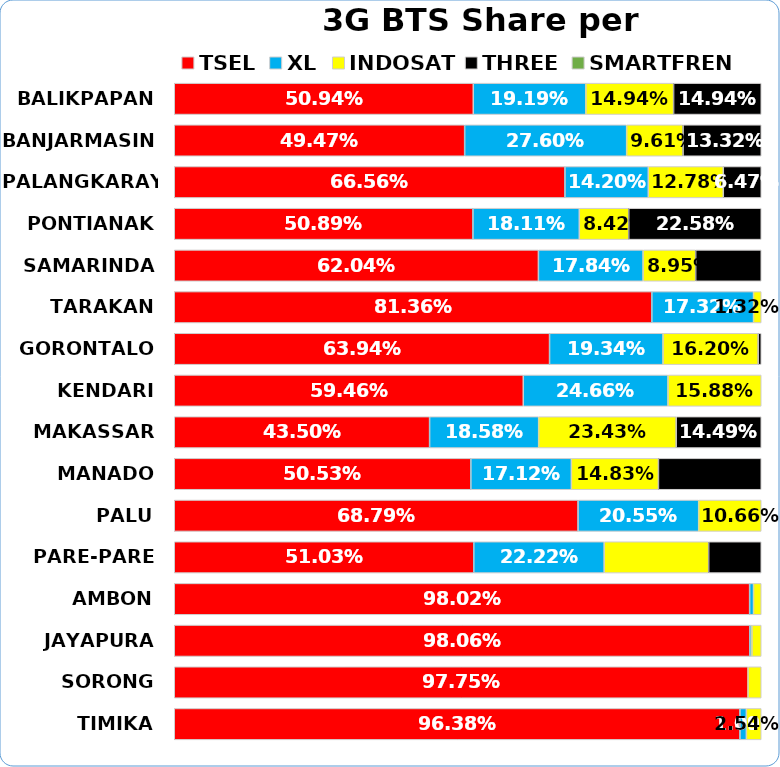
| Category | TSEL | XL | INDOSAT | THREE | SMARTFREN |
|---|---|---|---|---|---|
| BALIKPAPAN | 0.509 | 0.192 | 0.149 | 0.149 | 0 |
| BANJARMASIN | 0.495 | 0.276 | 0.096 | 0.133 | 0 |
| PALANGKARAYA | 0.666 | 0.142 | 0.128 | 0.065 | 0 |
| PONTIANAK | 0.509 | 0.181 | 0.084 | 0.226 | 0 |
| SAMARINDA | 0.62 | 0.178 | 0.09 | 0.112 | 0 |
| TARAKAN | 0.814 | 0.173 | 0.013 | 0 | 0 |
| GORONTALO | 0.639 | 0.193 | 0.162 | 0.005 | 0 |
| KENDARI | 0.595 | 0.247 | 0.159 | 0 | 0 |
| MAKASSAR | 0.435 | 0.186 | 0.234 | 0.145 | 0 |
| MANADO | 0.505 | 0.171 | 0.148 | 0.175 | 0 |
| PALU | 0.688 | 0.205 | 0.107 | 0 | 0 |
| PARE-PARE | 0.51 | 0.222 | 0.178 | 0.09 | 0 |
| AMBON | 0.98 | 0.007 | 0.013 | 0 | 0 |
| JAYAPURA | 0.981 | 0.004 | 0.016 | 0 | 0 |
| SORONG | 0.978 | 0 | 0.022 | 0 | 0 |
| TIMIKA | 0.964 | 0.011 | 0.025 | 0 | 0 |